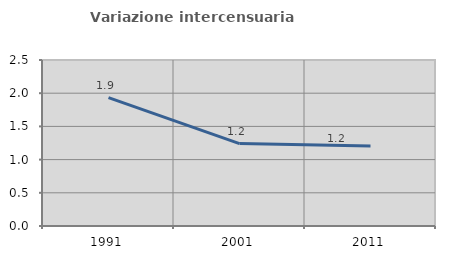
| Category | Variazione intercensuaria annua |
|---|---|
| 1991.0 | 1.933 |
| 2001.0 | 1.241 |
| 2011.0 | 1.205 |